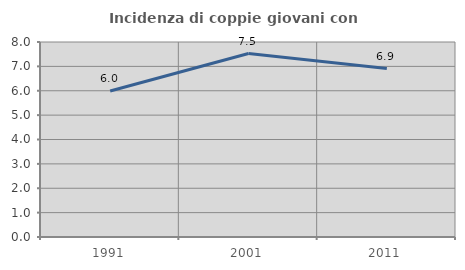
| Category | Incidenza di coppie giovani con figli |
|---|---|
| 1991.0 | 5.988 |
| 2001.0 | 7.527 |
| 2011.0 | 6.912 |